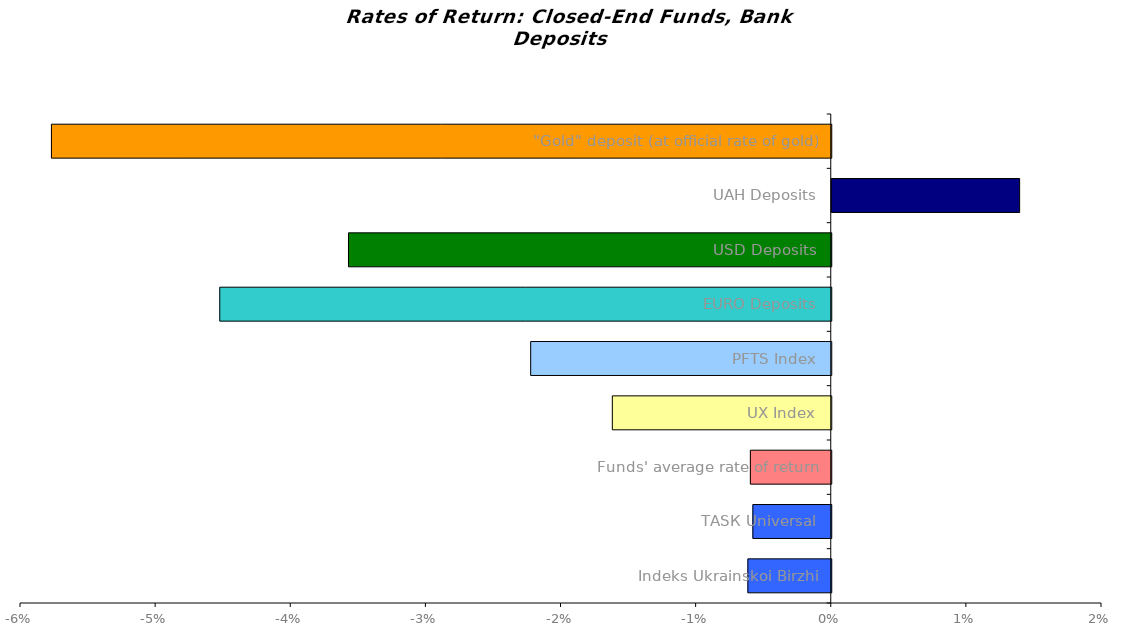
| Category | Series 0 |
|---|---|
| Іndeks Ukrainskoi Birzhi | -0.006 |
| ТАSК Universal | -0.006 |
| Funds' average rate of return | -0.006 |
| UX Index | -0.016 |
| PFTS Index | -0.022 |
| EURO Deposits | -0.045 |
| USD Deposits | -0.036 |
| UAH Deposits | 0.014 |
| "Gold" deposit (at official rate of gold) | -0.058 |